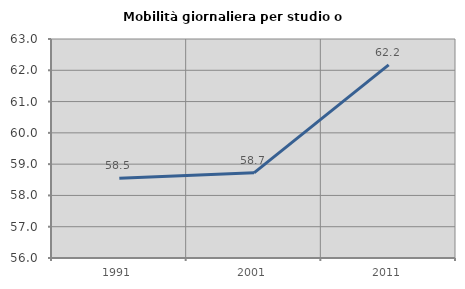
| Category | Mobilità giornaliera per studio o lavoro |
|---|---|
| 1991.0 | 58.545 |
| 2001.0 | 58.721 |
| 2011.0 | 62.175 |